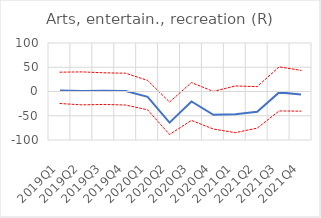
| Category | p25 | Median | p75 | Zero line |
|---|---|---|---|---|
| 2019Q1 | -24.751 | 1.871 | 39.844 | 0 |
| 2019Q2 | -27.554 | 1.198 | 40.424 | 0 |
| 2019Q3 | -26.685 | 1.566 | 38.556 | 0 |
| 2019Q4 | -27.909 | 1.055 | 37.691 | 0 |
| 2020Q1 | -37.8 | -10.971 | 22.776 | 0 |
| 2020Q2 | -88.64 | -64.232 | -21.713 | 0 |
| 2020Q3 | -59.599 | -20.631 | 18.429 | 0 |
| 2020Q4 | -77.377 | -48.041 | 0.16 | 0 |
| 2021Q1 | -84.84 | -46.986 | 11.439 | 0 |
| 2021Q2 | -75.58 | -41.691 | 10.008 | 0 |
| 2021Q3 | -40.049 | -1.841 | 50.869 | 0 |
| 2021Q4 | -40.536 | -6.342 | 43.493 | 0 |